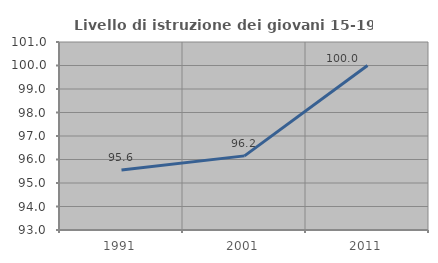
| Category | Livello di istruzione dei giovani 15-19 anni |
|---|---|
| 1991.0 | 95.556 |
| 2001.0 | 96.154 |
| 2011.0 | 100 |